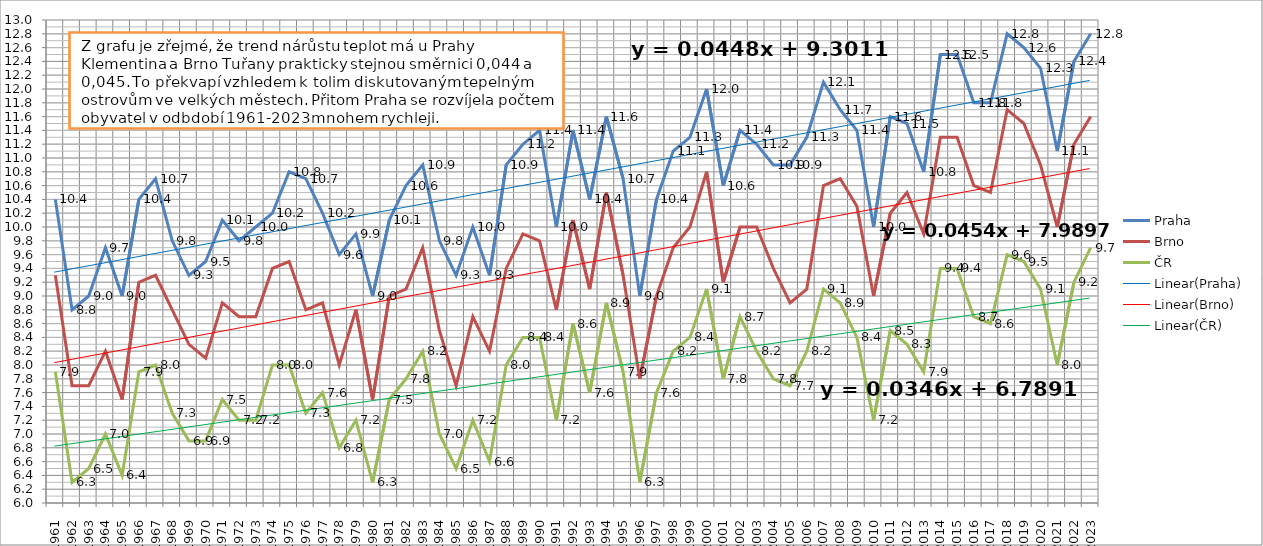
| Category | Praha | Brno | ČR |
|---|---|---|---|
| 1961 | 10.4 | 9.3 | 7.9 |
| 1962 | 8.8 | 7.7 | 6.3 |
| 1963 | 9 | 7.7 | 6.5 |
| 1964 | 9.7 | 8.2 | 7 |
| 1965 | 9 | 7.5 | 6.4 |
| 1966 | 10.4 | 9.2 | 7.9 |
| 1967 | 10.7 | 9.3 | 8 |
| 1968 | 9.8 | 8.8 | 7.3 |
| 1969 | 9.3 | 8.3 | 6.9 |
| 1970 | 9.5 | 8.1 | 6.9 |
| 1971 | 10.1 | 8.9 | 7.5 |
| 1972 | 9.8 | 8.7 | 7.2 |
| 1973 | 10 | 8.7 | 7.2 |
| 1974 | 10.2 | 9.4 | 8 |
| 1975 | 10.8 | 9.5 | 8 |
| 1976 | 10.7 | 8.8 | 7.3 |
| 1977 | 10.2 | 8.9 | 7.6 |
| 1978 | 9.6 | 8 | 6.8 |
| 1979 | 9.9 | 8.8 | 7.2 |
| 1980 | 9 | 7.5 | 6.3 |
| 1981 | 10.1 | 9 | 7.5 |
| 1982 | 10.6 | 9.1 | 7.8 |
| 1983 | 10.9 | 9.7 | 8.2 |
| 1984 | 9.8 | 8.5 | 7 |
| 1985 | 9.3 | 7.7 | 6.5 |
| 1986 | 10 | 8.7 | 7.2 |
| 1987 | 9.3 | 8.2 | 6.6 |
| 1988 | 10.9 | 9.4 | 8 |
| 1989 | 11.2 | 9.9 | 8.4 |
| 1990 | 11.4 | 9.8 | 8.4 |
| 1991 | 10 | 8.8 | 7.2 |
| 1992 | 11.4 | 10.1 | 8.6 |
| 1993 | 10.4 | 9.1 | 7.6 |
| 1994 | 11.6 | 10.5 | 8.9 |
| 1995 | 10.7 | 9.3 | 7.9 |
| 1996 | 9 | 7.8 | 6.3 |
| 1997 | 10.4 | 9 | 7.6 |
| 1998 | 11.1 | 9.7 | 8.2 |
| 1999 | 11.3 | 10 | 8.4 |
| 2000 | 12 | 10.8 | 9.1 |
| 2001 | 10.6 | 9.2 | 7.8 |
| 2002 | 11.4 | 10 | 8.7 |
| 2003 | 11.2 | 10 | 8.2 |
| 2004 | 10.9 | 9.4 | 7.8 |
| 2005 | 10.9 | 8.9 | 7.7 |
| 2006 | 11.3 | 9.1 | 8.2 |
| 2007 | 12.1 | 10.6 | 9.1 |
| 2008 | 11.7 | 10.7 | 8.9 |
| 2009 | 11.4 | 10.3 | 8.4 |
| 2010 | 10 | 9 | 7.2 |
| 2011 | 11.6 | 10.2 | 8.5 |
| 2012 | 11.5 | 10.5 | 8.3 |
| 2013 | 10.8 | 9.9 | 7.9 |
| 2014 | 12.5 | 11.3 | 9.4 |
| 2015 | 12.5 | 11.3 | 9.4 |
| 2016 | 11.8 | 10.6 | 8.7 |
| 2017 | 11.8 | 10.5 | 8.6 |
| 2018 | 12.8 | 11.7 | 9.6 |
| 2019 | 12.6 | 11.5 | 9.5 |
| 2020 | 12.3 | 10.9 | 9.1 |
| 2021 | 11.1 | 10 | 8 |
| 2022 | 12.4 | 11.2 | 9.2 |
| 2023 | 12.8 | 11.6 | 9.7 |